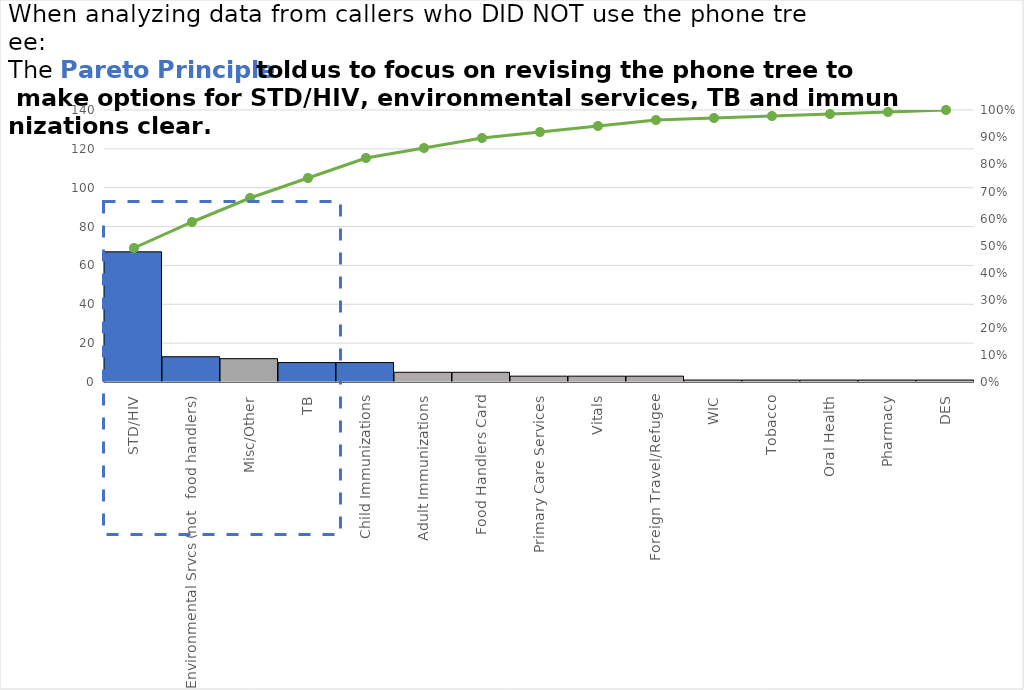
| Category | Total Calls: |
|---|---|
| STD/HIV | 67 |
| Environmental Srvcs (not   food handlers) | 13 |
| Misc/Other | 12 |
| TB | 10 |
| Child Immunizations | 10 |
| Adult Immunizations | 5 |
| Food Handlers Card | 5 |
| Primary Care Services | 3 |
| Vitals | 3 |
| Foreign Travel/Refugee | 3 |
| WIC | 1 |
| Tobacco | 1 |
| Oral Health | 1 |
| Pharmacy | 1 |
| DES | 1 |